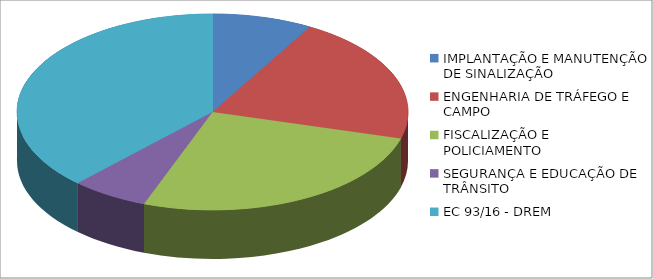
| Category | Series 0 | Series 1 |
|---|---|---|
| IMPLANTAÇÃO E MANUTENÇÃO DE SINALIZAÇÃO | 830279.147 |  |
| ENGENHARIA DE TRÁFEGO E CAMPO | 2111295.368 |  |
| FISCALIZAÇÃO E POLICIAMENTO | 2635668.458 |  |
| SEGURANÇA E EDUCAÇÃO DE TRÂNSITO | 640508.037 |  |
| EC 93/16 - DREM | 3796743.81 |  |